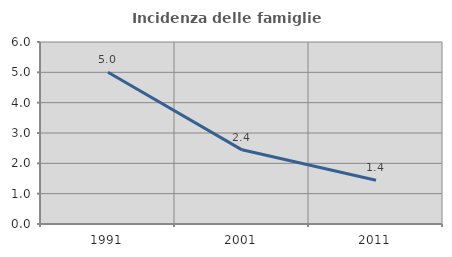
| Category | Incidenza delle famiglie numerose |
|---|---|
| 1991.0 | 5.003 |
| 2001.0 | 2.445 |
| 2011.0 | 1.441 |